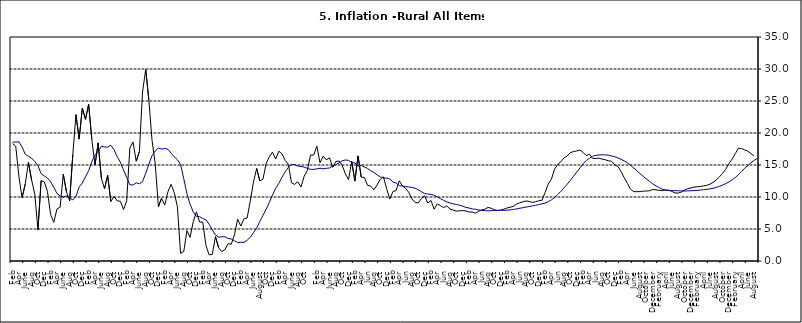
| Category | Series 0 | Series 1 |
|---|---|---|
| 09-Jan | 15.918 | 12.128 |
| Feb | 17.154 | 13.086 |
| Mar | 16.729 | 13.912 |
| Apr | 15.727 | 14.644 |
| May | 15.113 | 15.104 |
| June | 12.213 | 15.067 |
| July | 11.974 | 14.832 |
| Aug | 12.38 | 14.796 |
| Sept | 11.548 | 14.661 |
| Oct | 13.242 | 14.488 |
| Nov | 14.164 | 14.321 |
|  | 16.557 | 14.316 |
| 10-Jan | 16.548 | 14.39 |
| Feb | 17.934 | 14.494 |
| Mar | 15.346 | 14.401 |
| Apr | 16.373 | 14.473 |
| May | 15.794 | 14.54 |
| June | 16.126 | 14.862 |
| July | 14.634 | 15.072 |
| Aug | 15.556 | 15.33 |
| Sept | 15.616 | 15.658 |
| Oct | 14.955 | 15.786 |
| Nov | 13.616 | 15.719 |
| Dec | 12.735 | 15.385 |
| 11-Jan | 15.553 | 15.311 |
| Feb | 12.482 | 14.856 |
| Mar | 16.422 | 14.956 |
| Apr | 13.117 | 14.687 |
| May | 13.041 | 14.457 |
| Jun | 11.83 | 14.095 |
| Jul | 11.699 | 13.84 |
| Aug | 11.13 | 13.464 |
| Sep | 11.878 | 13.156 |
| Oct | 12.778 | 12.985 |
| Nov | 13.147 | 12.95 |
| Dec | 11.326 | 12.824 |
| 12-Jan | 9.678 | 12.33 |
| Feb | 10.856 | 12.188 |
| Mar | 11.014 | 11.76 |
| Apr | 12.536 | 11.724 |
| May | 11.712 | 11.621 |
| Jun | 11.36 | 11.582 |
| Jul | 10.733 | 11.499 |
| Aug | 9.683 | 11.368 |
| Sep | 9.132 | 11.131 |
| Oct | 9.071 | 10.82 |
| Nov | 9.758 | 10.548 |
| Dec | 10.183 | 10.455 |
| 13-Jan | 9.052 | 10.394 |
| Feb | 9.457 | 10.276 |
| Mar | 8.091 | 10.025 |
| Apr | 8.907 | 9.732 |
| May | 8.647 | 9.483 |
| Jun | 8.333 | 9.236 |
| Jul | 8.6 | 9.063 |
| Aug | 8.12 | 8.933 |
| Sep | 7.95 | 8.832 |
| Oct | 7.791 | 8.722 |
| Nov | 7.849 | 8.565 |
| Dec | 7.879 | 8.378 |
| 14-Jan | 7.832 | 8.277 |
| Feb | 7.657 | 8.13 |
| Mar | 7.65 | 8.092 |
| Apr | 7.473 | 7.973 |
| May | 7.761 | 7.901 |
| Jun | 7.98 | 7.874 |
| Jul | 8.086 | 7.834 |
| Aug | 8.368 | 7.858 |
| Sep | 8.244 | 7.883 |
| Oct | 8.019 | 7.903 |
| Nov | 7.898 | 7.906 |
| Dec | 7.955 | 7.913 |
| 15-Jan | 8.094 | 7.935 |
| Feb | 8.291 | 7.988 |
| Mar | 8.396 | 8.05 |
| Apr | 8.556 | 8.14 |
| May | 8.896 | 8.236 |
| Jun | 9.098 | 8.331 |
| Jul | 9.238 | 8.429 |
| Aug | 9.382 | 8.516 |
| Sep | 9.3 | 8.606 |
| Oct | 9.162 | 8.7 |
| Nov | 9.261 | 8.813 |
| Dec | 9.41 | 8.933 |
| 16-Jan | 9.48 | 9.047 |
| Feb | 10.692 | 9.249 |
| Mar | 12.038 | 9.559 |
| Apr | 12.767 | 9.917 |
| May | 14.349 | 10.384 |
| Jun | 15.088 | 10.897 |
| Jul | 15.533 | 11.433 |
| Aug | 16.103 | 12.002 |
| Sep | 16.428 | 12.601 |
| Oct | 16.947 | 13.25 |
| Nov | 17.099 | 13.898 |
| Dec | 17.195 | 14.54 |
| 17-Jan | 17.341 | 15.183 |
| Feb | 16.982 | 15.696 |
| Mar | 16.466 | 16.054 |
| Apr | 16.687 | 16.369 |
| May | 16.023 | 16.497 |
| Jun | 16.007 | 16.563 |
| Jul | 16.078 | 16.6 |
| Aug | 15.914 | 16.577 |
| Sep | 15.812 | 16.52 |
| Oct | 15.666 | 16.411 |
| Nov | 15.587 | 16.285 |
| Dec | 15.018 | 16.104 |
| 18-Jan | 14.756 | 15.892 |
| Feb | 13.957 | 15.638 |
| Mar | 12.987 | 15.339 |
| Apr | 12.126 | 14.95 |
| May | 11.199 | 14.53 |
| June | 10.832 | 14.083 |
| July | 10.831 | 13.636 |
| August | 10.838 | 13.209 |
| September | 10.924 | 12.804 |
| October | 10.927 | 12.418 |
| November | 10.986 | 12.049 |
| December | 11.183 | 11.746 |
| 19-Jan | 11.115 | 11.462 |
| February | 11.048 | 11.234 |
| March | 10.99 | 11.078 |
| April | 11.08 | 10.997 |
| May | 11.075 | 10.988 |
| June | 10.874 | 10.99 |
| July | 10.636 | 10.972 |
| August | 10.609 | 10.951 |
| September | 10.771 | 10.937 |
| October | 11.074 | 10.95 |
| November | 11.296 | 10.977 |
| December | 11.406 | 10.998 |
| January | 11.543 | 11.037 |
| February | 11.606 | 11.086 |
| March | 11.639 | 11.141 |
| April | 11.728 | 11.197 |
| May | 11.826 | 11.261 |
| June | 11.988 | 11.355 |
| July | 12.28 | 11.493 |
| August | 12.651 | 11.664 |
| September | 13.14 | 11.864 |
| October | 13.68 | 12.086 |
| November | 14.335 | 12.346 |
| December | 15.2 | 12.67 |
| January | 15.918 | 13.043 |
| February | 16.766 | 13.482 |
| March | 17.596 | 13.985 |
| April | 17.566 | 14.475 |
| May | 17.358 | 14.935 |
| June | 17.159 | 15.362 |
| July | 16.753 | 15.726 |
| August | 16.433 | 16.03 |